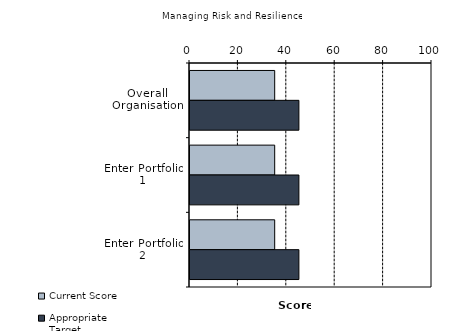
| Category | Current Score | Appropriate Target |
|---|---|---|
| Overall Organisation | 35 | 45 |
| Enter Portfolio 1 | 35 | 45 |
| Enter Portfolio 2 | 35 | 45 |